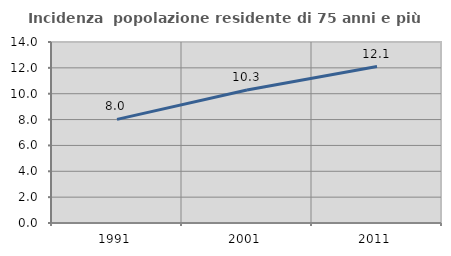
| Category | Incidenza  popolazione residente di 75 anni e più |
|---|---|
| 1991.0 | 8.016 |
| 2001.0 | 10.284 |
| 2011.0 | 12.1 |